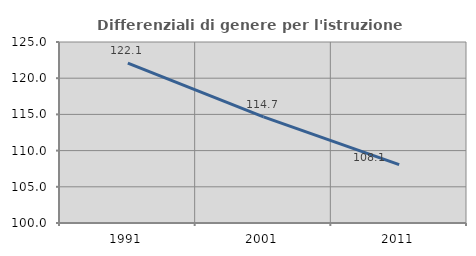
| Category | Differenziali di genere per l'istruzione superiore |
|---|---|
| 1991.0 | 122.096 |
| 2001.0 | 114.657 |
| 2011.0 | 108.055 |